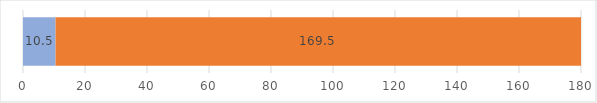
| Category | absolviert | übrig |
|---|---|---|
| 0 | 10.5 | 169.5 |